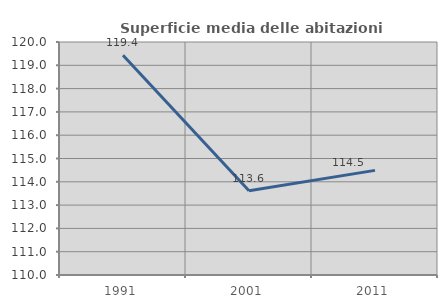
| Category | Superficie media delle abitazioni occupate |
|---|---|
| 1991.0 | 119.429 |
| 2001.0 | 113.619 |
| 2011.0 | 114.491 |